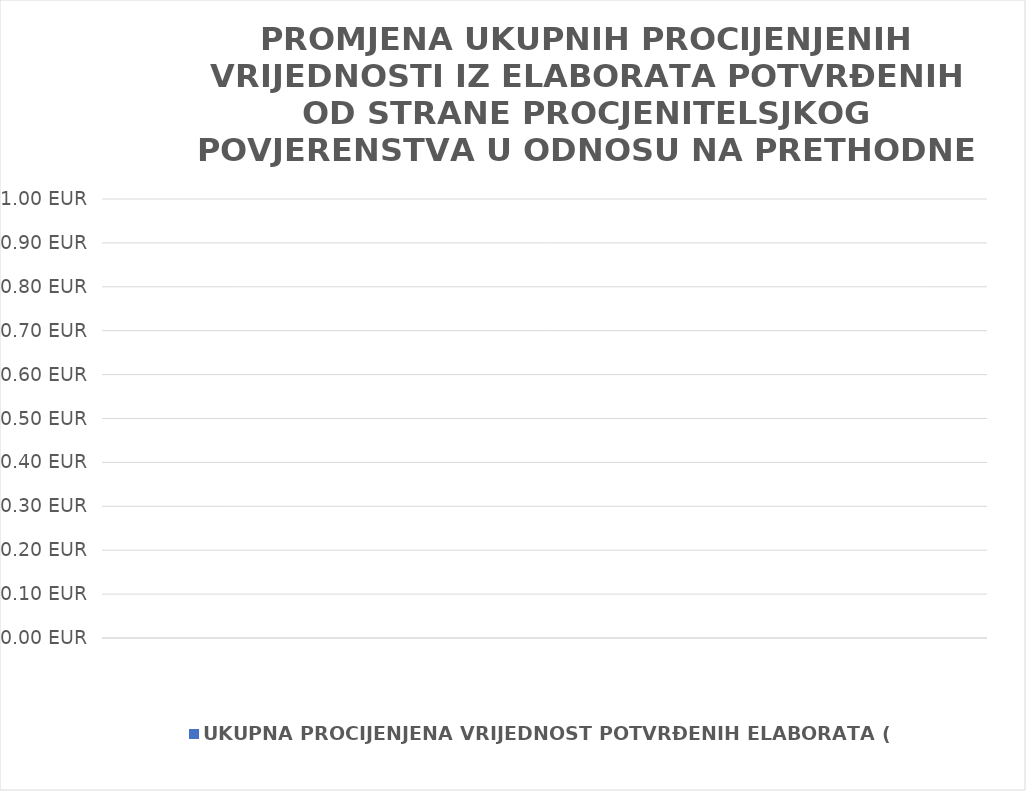
| Category | UKUPNA PROCIJENJENA VRIJEDNOST POTVRĐENIH ELABORATA (u eur) |
|---|---|
|  | 0 |
|  | 0 |